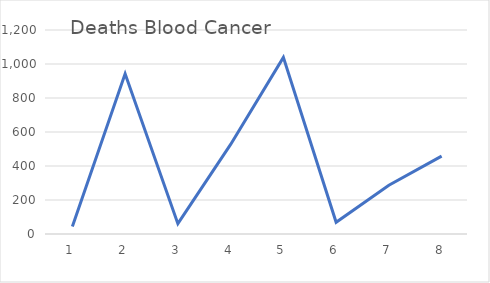
| Category | Deaths Blood Cancer |
|---|---|
| 0 | 44 |
| 1 | 942 |
| 2 | 61 |
| 3 | 527 |
| 4 | 1039 |
| 5 | 69 |
| 6 | 287 |
| 7 | 458 |